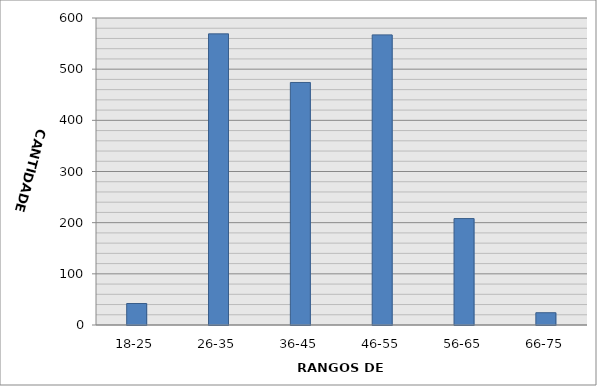
| Category | Series 0 |
|---|---|
| 18-25 | 42 |
| 26-35 | 569 |
| 36-45 | 474 |
| 46-55 | 567 |
| 56-65 | 208 |
| 66-75 | 24 |